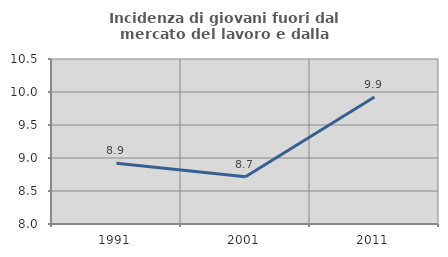
| Category | Incidenza di giovani fuori dal mercato del lavoro e dalla formazione  |
|---|---|
| 1991.0 | 8.919 |
| 2001.0 | 8.716 |
| 2011.0 | 9.926 |